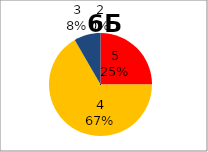
| Category | Series 0 |
|---|---|
| 5.0 | 3 |
| 4.0 | 8 |
| 3.0 | 1 |
| 2.0 | 0 |